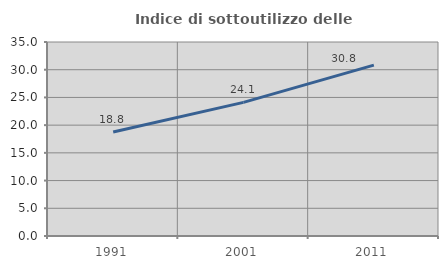
| Category | Indice di sottoutilizzo delle abitazioni  |
|---|---|
| 1991.0 | 18.766 |
| 2001.0 | 24.11 |
| 2011.0 | 30.837 |